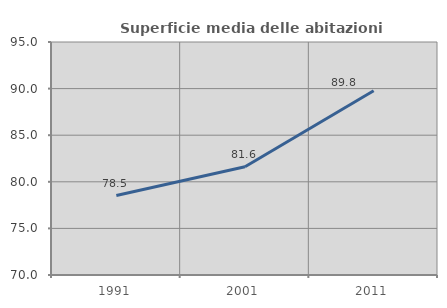
| Category | Superficie media delle abitazioni occupate |
|---|---|
| 1991.0 | 78.528 |
| 2001.0 | 81.618 |
| 2011.0 | 89.76 |